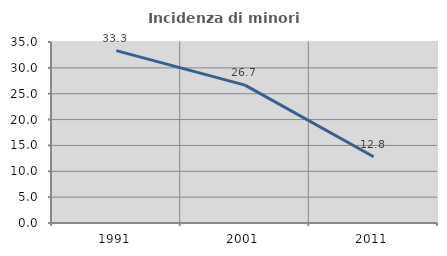
| Category | Incidenza di minori stranieri |
|---|---|
| 1991.0 | 33.333 |
| 2001.0 | 26.667 |
| 2011.0 | 12.821 |